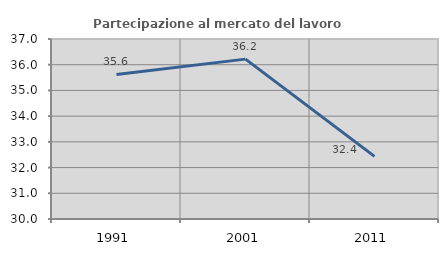
| Category | Partecipazione al mercato del lavoro  femminile |
|---|---|
| 1991.0 | 35.623 |
| 2001.0 | 36.218 |
| 2011.0 | 32.436 |